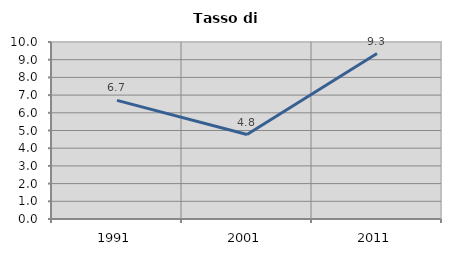
| Category | Tasso di disoccupazione   |
|---|---|
| 1991.0 | 6.701 |
| 2001.0 | 4.773 |
| 2011.0 | 9.348 |